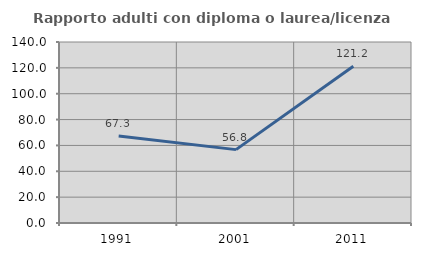
| Category | Rapporto adulti con diploma o laurea/licenza media  |
|---|---|
| 1991.0 | 67.347 |
| 2001.0 | 56.757 |
| 2011.0 | 121.212 |